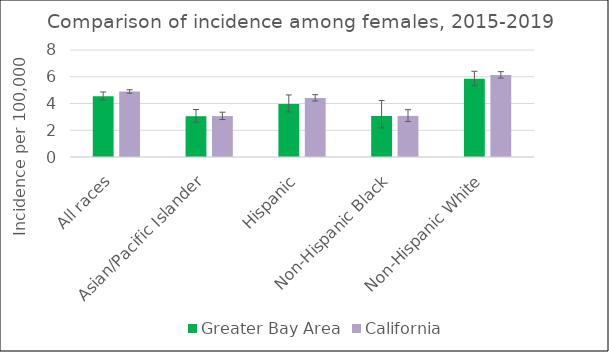
| Category | Greater Bay Area | California | SEER 18 |
|---|---|---|---|
| All races | 4.55 | 4.9 |  |
| Asian/Pacific Islander | 3.05 | 3.06 |  |
| Hispanic | 3.97 | 4.42 |  |
| Non-Hispanic Black | 3.07 | 3.07 |  |
| Non-Hispanic White | 5.85 | 6.13 |  |